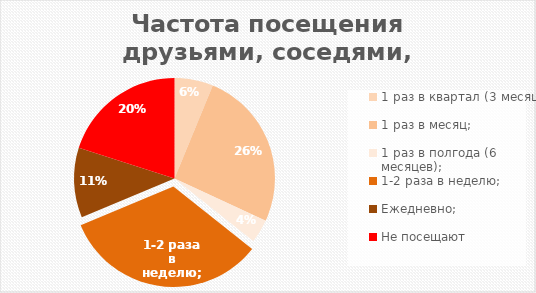
| Category | Итог |
|---|---|
| 1 раз в квартал (3 месяца); | 273 |
| 1 раз в месяц; | 1128 |
| 1 раз в полгода (6 месяцев); | 165 |
| 1-2 раза в неделю; | 1450 |
| Ежедневно; | 493 |
| Не посещают | 881 |